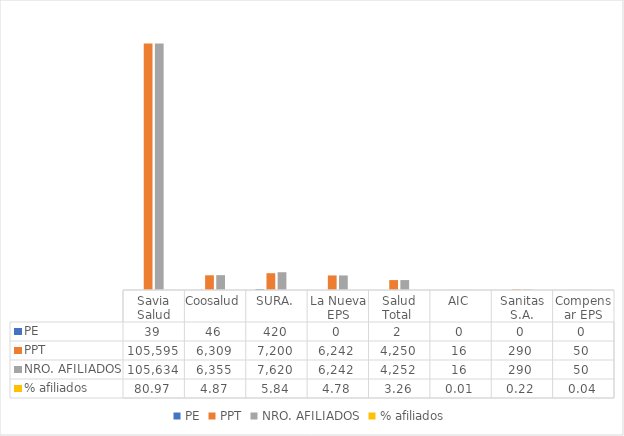
| Category | PE | PPT | NRO. AFILIADOS | % afiliados |
|---|---|---|---|---|
| Savia Salud | 39 | 105595 | 105634 | 80.97 |
| Coosalud | 46 | 6309 | 6355 | 4.871 |
| SURA. | 420 | 7200 | 7620 | 5.841 |
| La Nueva EPS | 0 | 6242 | 6242 | 4.785 |
| Salud Total  | 2 | 4250 | 4252 | 3.259 |
| AIC | 0 | 16 | 16 | 0.012 |
| Sanitas S.A. | 0 | 290 | 290 | 0.222 |
| Compensar EPS | 0 | 50 | 50 | 0.038 |